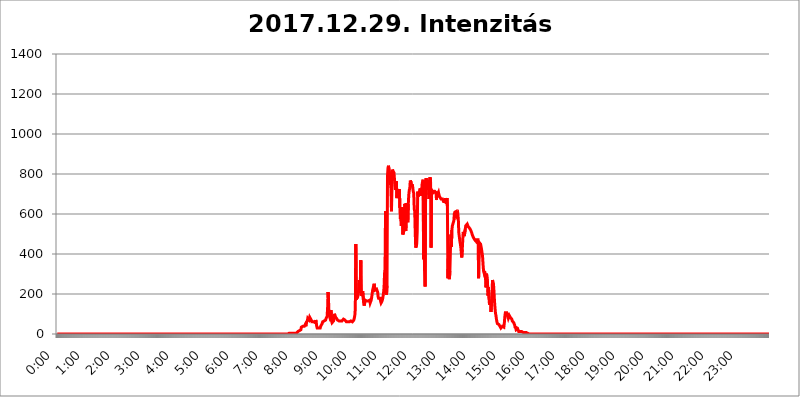
| Category | 2017.12.29. Intenzitás [W/m^2] |
|---|---|
| 0.0 | 0 |
| 0.0006944444444444445 | 0 |
| 0.001388888888888889 | 0 |
| 0.0020833333333333333 | 0 |
| 0.002777777777777778 | 0 |
| 0.003472222222222222 | 0 |
| 0.004166666666666667 | 0 |
| 0.004861111111111111 | 0 |
| 0.005555555555555556 | 0 |
| 0.0062499999999999995 | 0 |
| 0.006944444444444444 | 0 |
| 0.007638888888888889 | 0 |
| 0.008333333333333333 | 0 |
| 0.009027777777777779 | 0 |
| 0.009722222222222222 | 0 |
| 0.010416666666666666 | 0 |
| 0.011111111111111112 | 0 |
| 0.011805555555555555 | 0 |
| 0.012499999999999999 | 0 |
| 0.013194444444444444 | 0 |
| 0.013888888888888888 | 0 |
| 0.014583333333333332 | 0 |
| 0.015277777777777777 | 0 |
| 0.015972222222222224 | 0 |
| 0.016666666666666666 | 0 |
| 0.017361111111111112 | 0 |
| 0.018055555555555557 | 0 |
| 0.01875 | 0 |
| 0.019444444444444445 | 0 |
| 0.02013888888888889 | 0 |
| 0.020833333333333332 | 0 |
| 0.02152777777777778 | 0 |
| 0.022222222222222223 | 0 |
| 0.02291666666666667 | 0 |
| 0.02361111111111111 | 0 |
| 0.024305555555555556 | 0 |
| 0.024999999999999998 | 0 |
| 0.025694444444444447 | 0 |
| 0.02638888888888889 | 0 |
| 0.027083333333333334 | 0 |
| 0.027777777777777776 | 0 |
| 0.02847222222222222 | 0 |
| 0.029166666666666664 | 0 |
| 0.029861111111111113 | 0 |
| 0.030555555555555555 | 0 |
| 0.03125 | 0 |
| 0.03194444444444445 | 0 |
| 0.03263888888888889 | 0 |
| 0.03333333333333333 | 0 |
| 0.034027777777777775 | 0 |
| 0.034722222222222224 | 0 |
| 0.035416666666666666 | 0 |
| 0.036111111111111115 | 0 |
| 0.03680555555555556 | 0 |
| 0.0375 | 0 |
| 0.03819444444444444 | 0 |
| 0.03888888888888889 | 0 |
| 0.03958333333333333 | 0 |
| 0.04027777777777778 | 0 |
| 0.04097222222222222 | 0 |
| 0.041666666666666664 | 0 |
| 0.042361111111111106 | 0 |
| 0.04305555555555556 | 0 |
| 0.043750000000000004 | 0 |
| 0.044444444444444446 | 0 |
| 0.04513888888888889 | 0 |
| 0.04583333333333334 | 0 |
| 0.04652777777777778 | 0 |
| 0.04722222222222222 | 0 |
| 0.04791666666666666 | 0 |
| 0.04861111111111111 | 0 |
| 0.049305555555555554 | 0 |
| 0.049999999999999996 | 0 |
| 0.05069444444444445 | 0 |
| 0.051388888888888894 | 0 |
| 0.052083333333333336 | 0 |
| 0.05277777777777778 | 0 |
| 0.05347222222222222 | 0 |
| 0.05416666666666667 | 0 |
| 0.05486111111111111 | 0 |
| 0.05555555555555555 | 0 |
| 0.05625 | 0 |
| 0.05694444444444444 | 0 |
| 0.057638888888888885 | 0 |
| 0.05833333333333333 | 0 |
| 0.05902777777777778 | 0 |
| 0.059722222222222225 | 0 |
| 0.06041666666666667 | 0 |
| 0.061111111111111116 | 0 |
| 0.06180555555555556 | 0 |
| 0.0625 | 0 |
| 0.06319444444444444 | 0 |
| 0.06388888888888888 | 0 |
| 0.06458333333333334 | 0 |
| 0.06527777777777778 | 0 |
| 0.06597222222222222 | 0 |
| 0.06666666666666667 | 0 |
| 0.06736111111111111 | 0 |
| 0.06805555555555555 | 0 |
| 0.06874999999999999 | 0 |
| 0.06944444444444443 | 0 |
| 0.07013888888888889 | 0 |
| 0.07083333333333333 | 0 |
| 0.07152777777777779 | 0 |
| 0.07222222222222223 | 0 |
| 0.07291666666666667 | 0 |
| 0.07361111111111111 | 0 |
| 0.07430555555555556 | 0 |
| 0.075 | 0 |
| 0.07569444444444444 | 0 |
| 0.0763888888888889 | 0 |
| 0.07708333333333334 | 0 |
| 0.07777777777777778 | 0 |
| 0.07847222222222222 | 0 |
| 0.07916666666666666 | 0 |
| 0.0798611111111111 | 0 |
| 0.08055555555555556 | 0 |
| 0.08125 | 0 |
| 0.08194444444444444 | 0 |
| 0.08263888888888889 | 0 |
| 0.08333333333333333 | 0 |
| 0.08402777777777777 | 0 |
| 0.08472222222222221 | 0 |
| 0.08541666666666665 | 0 |
| 0.08611111111111112 | 0 |
| 0.08680555555555557 | 0 |
| 0.08750000000000001 | 0 |
| 0.08819444444444445 | 0 |
| 0.08888888888888889 | 0 |
| 0.08958333333333333 | 0 |
| 0.09027777777777778 | 0 |
| 0.09097222222222222 | 0 |
| 0.09166666666666667 | 0 |
| 0.09236111111111112 | 0 |
| 0.09305555555555556 | 0 |
| 0.09375 | 0 |
| 0.09444444444444444 | 0 |
| 0.09513888888888888 | 0 |
| 0.09583333333333333 | 0 |
| 0.09652777777777777 | 0 |
| 0.09722222222222222 | 0 |
| 0.09791666666666667 | 0 |
| 0.09861111111111111 | 0 |
| 0.09930555555555555 | 0 |
| 0.09999999999999999 | 0 |
| 0.10069444444444443 | 0 |
| 0.1013888888888889 | 0 |
| 0.10208333333333335 | 0 |
| 0.10277777777777779 | 0 |
| 0.10347222222222223 | 0 |
| 0.10416666666666667 | 0 |
| 0.10486111111111111 | 0 |
| 0.10555555555555556 | 0 |
| 0.10625 | 0 |
| 0.10694444444444444 | 0 |
| 0.1076388888888889 | 0 |
| 0.10833333333333334 | 0 |
| 0.10902777777777778 | 0 |
| 0.10972222222222222 | 0 |
| 0.1111111111111111 | 0 |
| 0.11180555555555556 | 0 |
| 0.11180555555555556 | 0 |
| 0.1125 | 0 |
| 0.11319444444444444 | 0 |
| 0.11388888888888889 | 0 |
| 0.11458333333333333 | 0 |
| 0.11527777777777777 | 0 |
| 0.11597222222222221 | 0 |
| 0.11666666666666665 | 0 |
| 0.1173611111111111 | 0 |
| 0.11805555555555557 | 0 |
| 0.11944444444444445 | 0 |
| 0.12013888888888889 | 0 |
| 0.12083333333333333 | 0 |
| 0.12152777777777778 | 0 |
| 0.12222222222222223 | 0 |
| 0.12291666666666667 | 0 |
| 0.12291666666666667 | 0 |
| 0.12361111111111112 | 0 |
| 0.12430555555555556 | 0 |
| 0.125 | 0 |
| 0.12569444444444444 | 0 |
| 0.12638888888888888 | 0 |
| 0.12708333333333333 | 0 |
| 0.16875 | 0 |
| 0.12847222222222224 | 0 |
| 0.12916666666666668 | 0 |
| 0.12986111111111112 | 0 |
| 0.13055555555555556 | 0 |
| 0.13125 | 0 |
| 0.13194444444444445 | 0 |
| 0.1326388888888889 | 0 |
| 0.13333333333333333 | 0 |
| 0.13402777777777777 | 0 |
| 0.13402777777777777 | 0 |
| 0.13472222222222222 | 0 |
| 0.13541666666666666 | 0 |
| 0.1361111111111111 | 0 |
| 0.13749999999999998 | 0 |
| 0.13819444444444443 | 0 |
| 0.1388888888888889 | 0 |
| 0.13958333333333334 | 0 |
| 0.14027777777777778 | 0 |
| 0.14097222222222222 | 0 |
| 0.14166666666666666 | 0 |
| 0.1423611111111111 | 0 |
| 0.14305555555555557 | 0 |
| 0.14375000000000002 | 0 |
| 0.14444444444444446 | 0 |
| 0.1451388888888889 | 0 |
| 0.1451388888888889 | 0 |
| 0.14652777777777778 | 0 |
| 0.14722222222222223 | 0 |
| 0.14791666666666667 | 0 |
| 0.1486111111111111 | 0 |
| 0.14930555555555555 | 0 |
| 0.15 | 0 |
| 0.15069444444444444 | 0 |
| 0.15138888888888888 | 0 |
| 0.15208333333333332 | 0 |
| 0.15277777777777776 | 0 |
| 0.15347222222222223 | 0 |
| 0.15416666666666667 | 0 |
| 0.15486111111111112 | 0 |
| 0.15555555555555556 | 0 |
| 0.15625 | 0 |
| 0.15694444444444444 | 0 |
| 0.15763888888888888 | 0 |
| 0.15833333333333333 | 0 |
| 0.15902777777777777 | 0 |
| 0.15972222222222224 | 0 |
| 0.16041666666666668 | 0 |
| 0.16111111111111112 | 0 |
| 0.16180555555555556 | 0 |
| 0.1625 | 0 |
| 0.16319444444444445 | 0 |
| 0.1638888888888889 | 0 |
| 0.16458333333333333 | 0 |
| 0.16527777777777777 | 0 |
| 0.16597222222222222 | 0 |
| 0.16666666666666666 | 0 |
| 0.1673611111111111 | 0 |
| 0.16805555555555554 | 0 |
| 0.16874999999999998 | 0 |
| 0.16944444444444443 | 0 |
| 0.17013888888888887 | 0 |
| 0.1708333333333333 | 0 |
| 0.17152777777777775 | 0 |
| 0.17222222222222225 | 0 |
| 0.1729166666666667 | 0 |
| 0.17361111111111113 | 0 |
| 0.17430555555555557 | 0 |
| 0.17500000000000002 | 0 |
| 0.17569444444444446 | 0 |
| 0.1763888888888889 | 0 |
| 0.17708333333333334 | 0 |
| 0.17777777777777778 | 0 |
| 0.17847222222222223 | 0 |
| 0.17916666666666667 | 0 |
| 0.1798611111111111 | 0 |
| 0.18055555555555555 | 0 |
| 0.18125 | 0 |
| 0.18194444444444444 | 0 |
| 0.1826388888888889 | 0 |
| 0.18333333333333335 | 0 |
| 0.1840277777777778 | 0 |
| 0.18472222222222223 | 0 |
| 0.18541666666666667 | 0 |
| 0.18611111111111112 | 0 |
| 0.18680555555555556 | 0 |
| 0.1875 | 0 |
| 0.18819444444444444 | 0 |
| 0.18888888888888888 | 0 |
| 0.18958333333333333 | 0 |
| 0.19027777777777777 | 0 |
| 0.1909722222222222 | 0 |
| 0.19166666666666665 | 0 |
| 0.19236111111111112 | 0 |
| 0.19305555555555554 | 0 |
| 0.19375 | 0 |
| 0.19444444444444445 | 0 |
| 0.1951388888888889 | 0 |
| 0.19583333333333333 | 0 |
| 0.19652777777777777 | 0 |
| 0.19722222222222222 | 0 |
| 0.19791666666666666 | 0 |
| 0.1986111111111111 | 0 |
| 0.19930555555555554 | 0 |
| 0.19999999999999998 | 0 |
| 0.20069444444444443 | 0 |
| 0.20138888888888887 | 0 |
| 0.2020833333333333 | 0 |
| 0.2027777777777778 | 0 |
| 0.2034722222222222 | 0 |
| 0.2041666666666667 | 0 |
| 0.20486111111111113 | 0 |
| 0.20555555555555557 | 0 |
| 0.20625000000000002 | 0 |
| 0.20694444444444446 | 0 |
| 0.2076388888888889 | 0 |
| 0.20833333333333334 | 0 |
| 0.20902777777777778 | 0 |
| 0.20972222222222223 | 0 |
| 0.21041666666666667 | 0 |
| 0.2111111111111111 | 0 |
| 0.21180555555555555 | 0 |
| 0.2125 | 0 |
| 0.21319444444444444 | 0 |
| 0.2138888888888889 | 0 |
| 0.21458333333333335 | 0 |
| 0.2152777777777778 | 0 |
| 0.21597222222222223 | 0 |
| 0.21666666666666667 | 0 |
| 0.21736111111111112 | 0 |
| 0.21805555555555556 | 0 |
| 0.21875 | 0 |
| 0.21944444444444444 | 0 |
| 0.22013888888888888 | 0 |
| 0.22083333333333333 | 0 |
| 0.22152777777777777 | 0 |
| 0.2222222222222222 | 0 |
| 0.22291666666666665 | 0 |
| 0.2236111111111111 | 0 |
| 0.22430555555555556 | 0 |
| 0.225 | 0 |
| 0.22569444444444445 | 0 |
| 0.2263888888888889 | 0 |
| 0.22708333333333333 | 0 |
| 0.22777777777777777 | 0 |
| 0.22847222222222222 | 0 |
| 0.22916666666666666 | 0 |
| 0.2298611111111111 | 0 |
| 0.23055555555555554 | 0 |
| 0.23124999999999998 | 0 |
| 0.23194444444444443 | 0 |
| 0.23263888888888887 | 0 |
| 0.2333333333333333 | 0 |
| 0.2340277777777778 | 0 |
| 0.2347222222222222 | 0 |
| 0.2354166666666667 | 0 |
| 0.23611111111111113 | 0 |
| 0.23680555555555557 | 0 |
| 0.23750000000000002 | 0 |
| 0.23819444444444446 | 0 |
| 0.2388888888888889 | 0 |
| 0.23958333333333334 | 0 |
| 0.24027777777777778 | 0 |
| 0.24097222222222223 | 0 |
| 0.24166666666666667 | 0 |
| 0.2423611111111111 | 0 |
| 0.24305555555555555 | 0 |
| 0.24375 | 0 |
| 0.24444444444444446 | 0 |
| 0.24513888888888888 | 0 |
| 0.24583333333333335 | 0 |
| 0.2465277777777778 | 0 |
| 0.24722222222222223 | 0 |
| 0.24791666666666667 | 0 |
| 0.24861111111111112 | 0 |
| 0.24930555555555556 | 0 |
| 0.25 | 0 |
| 0.25069444444444444 | 0 |
| 0.2513888888888889 | 0 |
| 0.2520833333333333 | 0 |
| 0.25277777777777777 | 0 |
| 0.2534722222222222 | 0 |
| 0.25416666666666665 | 0 |
| 0.2548611111111111 | 0 |
| 0.2555555555555556 | 0 |
| 0.25625000000000003 | 0 |
| 0.2569444444444445 | 0 |
| 0.2576388888888889 | 0 |
| 0.25833333333333336 | 0 |
| 0.2590277777777778 | 0 |
| 0.25972222222222224 | 0 |
| 0.2604166666666667 | 0 |
| 0.2611111111111111 | 0 |
| 0.26180555555555557 | 0 |
| 0.2625 | 0 |
| 0.26319444444444445 | 0 |
| 0.2638888888888889 | 0 |
| 0.26458333333333334 | 0 |
| 0.2652777777777778 | 0 |
| 0.2659722222222222 | 0 |
| 0.26666666666666666 | 0 |
| 0.2673611111111111 | 0 |
| 0.26805555555555555 | 0 |
| 0.26875 | 0 |
| 0.26944444444444443 | 0 |
| 0.2701388888888889 | 0 |
| 0.2708333333333333 | 0 |
| 0.27152777777777776 | 0 |
| 0.2722222222222222 | 0 |
| 0.27291666666666664 | 0 |
| 0.2736111111111111 | 0 |
| 0.2743055555555555 | 0 |
| 0.27499999999999997 | 0 |
| 0.27569444444444446 | 0 |
| 0.27638888888888885 | 0 |
| 0.27708333333333335 | 0 |
| 0.2777777777777778 | 0 |
| 0.27847222222222223 | 0 |
| 0.2791666666666667 | 0 |
| 0.2798611111111111 | 0 |
| 0.28055555555555556 | 0 |
| 0.28125 | 0 |
| 0.28194444444444444 | 0 |
| 0.2826388888888889 | 0 |
| 0.2833333333333333 | 0 |
| 0.28402777777777777 | 0 |
| 0.2847222222222222 | 0 |
| 0.28541666666666665 | 0 |
| 0.28611111111111115 | 0 |
| 0.28680555555555554 | 0 |
| 0.28750000000000003 | 0 |
| 0.2881944444444445 | 0 |
| 0.2888888888888889 | 0 |
| 0.28958333333333336 | 0 |
| 0.2902777777777778 | 0 |
| 0.29097222222222224 | 0 |
| 0.2916666666666667 | 0 |
| 0.2923611111111111 | 0 |
| 0.29305555555555557 | 0 |
| 0.29375 | 0 |
| 0.29444444444444445 | 0 |
| 0.2951388888888889 | 0 |
| 0.29583333333333334 | 0 |
| 0.2965277777777778 | 0 |
| 0.2972222222222222 | 0 |
| 0.29791666666666666 | 0 |
| 0.2986111111111111 | 0 |
| 0.29930555555555555 | 0 |
| 0.3 | 0 |
| 0.30069444444444443 | 0 |
| 0.3013888888888889 | 0 |
| 0.3020833333333333 | 0 |
| 0.30277777777777776 | 0 |
| 0.3034722222222222 | 0 |
| 0.30416666666666664 | 0 |
| 0.3048611111111111 | 0 |
| 0.3055555555555555 | 0 |
| 0.30624999999999997 | 0 |
| 0.3069444444444444 | 0 |
| 0.3076388888888889 | 0 |
| 0.30833333333333335 | 0 |
| 0.3090277777777778 | 0 |
| 0.30972222222222223 | 0 |
| 0.3104166666666667 | 0 |
| 0.3111111111111111 | 0 |
| 0.31180555555555556 | 0 |
| 0.3125 | 0 |
| 0.31319444444444444 | 0 |
| 0.3138888888888889 | 0 |
| 0.3145833333333333 | 0 |
| 0.31527777777777777 | 0 |
| 0.3159722222222222 | 3.525 |
| 0.31666666666666665 | 0 |
| 0.31736111111111115 | 3.525 |
| 0.31805555555555554 | 0 |
| 0.31875000000000003 | 0 |
| 0.3194444444444445 | 0 |
| 0.3201388888888889 | 0 |
| 0.32083333333333336 | 0 |
| 0.3215277777777778 | 0 |
| 0.32222222222222224 | 0 |
| 0.3229166666666667 | 0 |
| 0.3236111111111111 | 3.525 |
| 0.32430555555555557 | 3.525 |
| 0.325 | 3.525 |
| 0.32569444444444445 | 3.525 |
| 0.3263888888888889 | 3.525 |
| 0.32708333333333334 | 3.525 |
| 0.3277777777777778 | 3.525 |
| 0.3284722222222222 | 3.525 |
| 0.32916666666666666 | 3.525 |
| 0.3298611111111111 | 3.525 |
| 0.33055555555555555 | 3.525 |
| 0.33125 | 3.525 |
| 0.33194444444444443 | 3.525 |
| 0.3326388888888889 | 3.525 |
| 0.3333333333333333 | 3.525 |
| 0.3340277777777778 | 3.525 |
| 0.3347222222222222 | 3.525 |
| 0.3354166666666667 | 3.525 |
| 0.3361111111111111 | 7.887 |
| 0.3368055555555556 | 7.887 |
| 0.33749999999999997 | 12.257 |
| 0.33819444444444446 | 12.257 |
| 0.33888888888888885 | 16.636 |
| 0.33958333333333335 | 16.636 |
| 0.34027777777777773 | 21.024 |
| 0.34097222222222223 | 21.024 |
| 0.3416666666666666 | 21.024 |
| 0.3423611111111111 | 34.234 |
| 0.3430555555555555 | 29.823 |
| 0.34375 | 34.234 |
| 0.3444444444444445 | 38.653 |
| 0.3451388888888889 | 43.079 |
| 0.3458333333333334 | 34.234 |
| 0.34652777777777777 | 38.653 |
| 0.34722222222222227 | 38.653 |
| 0.34791666666666665 | 47.511 |
| 0.34861111111111115 | 38.653 |
| 0.34930555555555554 | 56.398 |
| 0.35000000000000003 | 60.85 |
| 0.3506944444444444 | 65.31 |
| 0.3513888888888889 | 78.722 |
| 0.3520833333333333 | 78.722 |
| 0.3527777777777778 | 78.722 |
| 0.3534722222222222 | 69.775 |
| 0.3541666666666667 | 83.205 |
| 0.3548611111111111 | 78.722 |
| 0.35555555555555557 | 74.246 |
| 0.35625 | 74.246 |
| 0.35694444444444445 | 69.775 |
| 0.3576388888888889 | 60.85 |
| 0.35833333333333334 | 60.85 |
| 0.3590277777777778 | 60.85 |
| 0.3597222222222222 | 60.85 |
| 0.36041666666666666 | 56.398 |
| 0.3611111111111111 | 65.31 |
| 0.36180555555555555 | 56.398 |
| 0.3625 | 69.775 |
| 0.36319444444444443 | 60.85 |
| 0.3638888888888889 | 38.653 |
| 0.3645833333333333 | 29.823 |
| 0.3652777777777778 | 29.823 |
| 0.3659722222222222 | 25.419 |
| 0.3666666666666667 | 29.823 |
| 0.3673611111111111 | 29.823 |
| 0.3680555555555556 | 34.234 |
| 0.36874999999999997 | 29.823 |
| 0.36944444444444446 | 38.653 |
| 0.37013888888888885 | 38.653 |
| 0.37083333333333335 | 43.079 |
| 0.37152777777777773 | 51.951 |
| 0.37222222222222223 | 60.85 |
| 0.3729166666666666 | 65.31 |
| 0.3736111111111111 | 65.31 |
| 0.3743055555555555 | 65.31 |
| 0.375 | 60.85 |
| 0.3756944444444445 | 65.31 |
| 0.3763888888888889 | 69.775 |
| 0.3770833333333334 | 78.722 |
| 0.37777777777777777 | 74.246 |
| 0.37847222222222227 | 87.692 |
| 0.37916666666666665 | 128.284 |
| 0.37986111111111115 | 210.182 |
| 0.38055555555555554 | 160.056 |
| 0.38125000000000003 | 96.682 |
| 0.3819444444444444 | 87.692 |
| 0.3826388888888889 | 96.682 |
| 0.3833333333333333 | 92.184 |
| 0.3840277777777778 | 119.235 |
| 0.3847222222222222 | 65.31 |
| 0.3854166666666667 | 56.398 |
| 0.3861111111111111 | 56.398 |
| 0.38680555555555557 | 60.85 |
| 0.3875 | 65.31 |
| 0.38819444444444445 | 74.246 |
| 0.3888888888888889 | 101.184 |
| 0.38958333333333334 | 87.692 |
| 0.3902777777777778 | 83.205 |
| 0.3909722222222222 | 83.205 |
| 0.39166666666666666 | 78.722 |
| 0.3923611111111111 | 74.246 |
| 0.39305555555555555 | 69.775 |
| 0.39375 | 69.775 |
| 0.39444444444444443 | 65.31 |
| 0.3951388888888889 | 65.31 |
| 0.3958333333333333 | 65.31 |
| 0.3965277777777778 | 65.31 |
| 0.3972222222222222 | 65.31 |
| 0.3979166666666667 | 65.31 |
| 0.3986111111111111 | 65.31 |
| 0.3993055555555556 | 65.31 |
| 0.39999999999999997 | 65.31 |
| 0.40069444444444446 | 69.775 |
| 0.40138888888888885 | 74.246 |
| 0.40208333333333335 | 74.246 |
| 0.40277777777777773 | 74.246 |
| 0.40347222222222223 | 69.775 |
| 0.4041666666666666 | 69.775 |
| 0.4048611111111111 | 65.31 |
| 0.4055555555555555 | 60.85 |
| 0.40625 | 60.85 |
| 0.4069444444444445 | 60.85 |
| 0.4076388888888889 | 60.85 |
| 0.4083333333333334 | 60.85 |
| 0.40902777777777777 | 60.85 |
| 0.40972222222222227 | 60.85 |
| 0.41041666666666665 | 60.85 |
| 0.41111111111111115 | 65.31 |
| 0.41180555555555554 | 65.31 |
| 0.41250000000000003 | 65.31 |
| 0.4131944444444444 | 60.85 |
| 0.4138888888888889 | 60.85 |
| 0.4145833333333333 | 60.85 |
| 0.4152777777777778 | 65.31 |
| 0.4159722222222222 | 69.775 |
| 0.4166666666666667 | 74.246 |
| 0.4173611111111111 | 92.184 |
| 0.41805555555555557 | 128.284 |
| 0.41875 | 449.551 |
| 0.41944444444444445 | 173.709 |
| 0.4201388888888889 | 173.709 |
| 0.42083333333333334 | 173.709 |
| 0.4215277777777778 | 187.378 |
| 0.4222222222222222 | 201.058 |
| 0.42291666666666666 | 223.873 |
| 0.4236111111111111 | 269.49 |
| 0.42430555555555555 | 269.49 |
| 0.425 | 219.309 |
| 0.42569444444444443 | 369.23 |
| 0.4263888888888889 | 191.937 |
| 0.4270833333333333 | 191.937 |
| 0.4277777777777778 | 205.62 |
| 0.4284722222222222 | 214.746 |
| 0.4291666666666667 | 178.264 |
| 0.4298611111111111 | 150.964 |
| 0.4305555555555556 | 141.884 |
| 0.43124999999999997 | 155.509 |
| 0.43194444444444446 | 169.156 |
| 0.43263888888888885 | 164.605 |
| 0.43333333333333335 | 164.605 |
| 0.43402777777777773 | 164.605 |
| 0.43472222222222223 | 160.056 |
| 0.4354166666666666 | 164.605 |
| 0.4361111111111111 | 164.605 |
| 0.4368055555555555 | 160.056 |
| 0.4375 | 169.156 |
| 0.4381944444444445 | 169.156 |
| 0.4388888888888889 | 155.509 |
| 0.4395833333333334 | 155.509 |
| 0.44027777777777777 | 169.156 |
| 0.44097222222222227 | 182.82 |
| 0.44166666666666665 | 201.058 |
| 0.44236111111111115 | 219.309 |
| 0.44305555555555554 | 214.746 |
| 0.44375000000000003 | 223.873 |
| 0.4444444444444444 | 251.251 |
| 0.4451388888888889 | 233 |
| 0.4458333333333333 | 219.309 |
| 0.4465277777777778 | 214.746 |
| 0.4472222222222222 | 223.873 |
| 0.4479166666666667 | 223.873 |
| 0.4486111111111111 | 223.873 |
| 0.44930555555555557 | 210.182 |
| 0.45 | 187.378 |
| 0.45069444444444445 | 178.264 |
| 0.4513888888888889 | 178.264 |
| 0.45208333333333334 | 178.264 |
| 0.4527777777777778 | 178.264 |
| 0.4534722222222222 | 164.605 |
| 0.45416666666666666 | 155.509 |
| 0.4548611111111111 | 155.509 |
| 0.45555555555555555 | 164.605 |
| 0.45625 | 173.709 |
| 0.45694444444444443 | 187.378 |
| 0.4576388888888889 | 205.62 |
| 0.4583333333333333 | 233 |
| 0.4590277777777778 | 301.354 |
| 0.4597222222222222 | 328.584 |
| 0.4604166666666667 | 613.252 |
| 0.4611111111111111 | 233 |
| 0.4618055555555556 | 196.497 |
| 0.46249999999999997 | 242.127 |
| 0.46319444444444446 | 791.169 |
| 0.46388888888888885 | 829.981 |
| 0.46458333333333335 | 841.526 |
| 0.46527777777777773 | 837.682 |
| 0.46597222222222223 | 802.868 |
| 0.4666666666666666 | 791.169 |
| 0.4673611111111111 | 755.766 |
| 0.4680555555555555 | 723.889 |
| 0.46875 | 613.252 |
| 0.4694444444444445 | 798.974 |
| 0.4701388888888889 | 822.26 |
| 0.4708333333333334 | 814.519 |
| 0.47152777777777777 | 818.392 |
| 0.47222222222222227 | 806.757 |
| 0.47291666666666665 | 806.757 |
| 0.47361111111111115 | 810.641 |
| 0.47430555555555554 | 719.877 |
| 0.47500000000000003 | 751.803 |
| 0.4756944444444444 | 763.674 |
| 0.4763888888888889 | 679.395 |
| 0.4770833333333333 | 683.473 |
| 0.4777777777777778 | 711.832 |
| 0.4784722222222222 | 711.832 |
| 0.4791666666666667 | 687.544 |
| 0.4798611111111111 | 723.889 |
| 0.48055555555555557 | 629.948 |
| 0.48125 | 575.299 |
| 0.48194444444444445 | 588.009 |
| 0.4826388888888889 | 541.121 |
| 0.48333333333333334 | 583.779 |
| 0.4840277777777778 | 634.105 |
| 0.4847222222222222 | 497.836 |
| 0.48541666666666666 | 497.836 |
| 0.4861111111111111 | 515.223 |
| 0.48680555555555555 | 536.82 |
| 0.4875 | 650.667 |
| 0.48819444444444443 | 583.779 |
| 0.4888888888888889 | 515.223 |
| 0.4895833333333333 | 654.791 |
| 0.4902777777777778 | 654.791 |
| 0.4909722222222222 | 592.233 |
| 0.4916666666666667 | 558.261 |
| 0.4923611111111111 | 650.667 |
| 0.4930555555555556 | 695.666 |
| 0.49374999999999997 | 719.877 |
| 0.49444444444444446 | 727.896 |
| 0.49513888888888885 | 767.62 |
| 0.49583333333333335 | 767.62 |
| 0.49652777777777773 | 755.766 |
| 0.49722222222222223 | 735.89 |
| 0.4979166666666666 | 747.834 |
| 0.4986111111111111 | 731.896 |
| 0.4993055555555555 | 711.832 |
| 0.5 | 703.762 |
| 0.5006944444444444 | 625.784 |
| 0.5013888888888889 | 613.252 |
| 0.5020833333333333 | 506.542 |
| 0.5027777777777778 | 431.833 |
| 0.5034722222222222 | 431.833 |
| 0.5041666666666667 | 449.551 |
| 0.5048611111111111 | 510.885 |
| 0.5055555555555555 | 711.832 |
| 0.50625 | 687.544 |
| 0.5069444444444444 | 699.717 |
| 0.5076388888888889 | 707.8 |
| 0.5083333333333333 | 715.858 |
| 0.5090277777777777 | 727.896 |
| 0.5097222222222222 | 691.608 |
| 0.5104166666666666 | 699.717 |
| 0.5111111111111112 | 719.877 |
| 0.5118055555555555 | 751.803 |
| 0.5125000000000001 | 755.766 |
| 0.5131944444444444 | 771.559 |
| 0.513888888888889 | 373.729 |
| 0.5145833333333333 | 440.702 |
| 0.5152777777777778 | 314.98 |
| 0.5159722222222222 | 237.564 |
| 0.5166666666666667 | 763.674 |
| 0.517361111111111 | 779.42 |
| 0.5180555555555556 | 751.803 |
| 0.5187499999999999 | 723.889 |
| 0.5194444444444445 | 755.766 |
| 0.5201388888888888 | 771.559 |
| 0.5208333333333334 | 767.62 |
| 0.5215277777777778 | 675.311 |
| 0.5222222222222223 | 671.22 |
| 0.5229166666666667 | 783.342 |
| 0.5236111111111111 | 759.723 |
| 0.5243055555555556 | 431.833 |
| 0.525 | 719.877 |
| 0.5256944444444445 | 715.858 |
| 0.5263888888888889 | 711.832 |
| 0.5270833333333333 | 719.877 |
| 0.5277777777777778 | 707.8 |
| 0.5284722222222222 | 711.832 |
| 0.5291666666666667 | 711.832 |
| 0.5298611111111111 | 711.832 |
| 0.5305555555555556 | 711.832 |
| 0.53125 | 703.762 |
| 0.5319444444444444 | 671.22 |
| 0.5326388888888889 | 711.832 |
| 0.5333333333333333 | 695.666 |
| 0.5340277777777778 | 699.717 |
| 0.5347222222222222 | 707.8 |
| 0.5354166666666667 | 695.666 |
| 0.5361111111111111 | 687.544 |
| 0.5368055555555555 | 683.473 |
| 0.5375 | 683.473 |
| 0.5381944444444444 | 675.311 |
| 0.5388888888888889 | 671.22 |
| 0.5395833333333333 | 675.311 |
| 0.5402777777777777 | 675.311 |
| 0.5409722222222222 | 675.311 |
| 0.5416666666666666 | 663.019 |
| 0.5423611111111112 | 658.909 |
| 0.5430555555555555 | 663.019 |
| 0.5437500000000001 | 663.019 |
| 0.5444444444444444 | 679.395 |
| 0.545138888888889 | 675.311 |
| 0.5458333333333333 | 650.667 |
| 0.5465277777777778 | 679.395 |
| 0.5472222222222222 | 638.256 |
| 0.5479166666666667 | 278.603 |
| 0.548611111111111 | 382.715 |
| 0.5493055555555556 | 287.709 |
| 0.5499999999999999 | 274.047 |
| 0.5506944444444445 | 314.98 |
| 0.5513888888888888 | 414.035 |
| 0.5520833333333334 | 497.836 |
| 0.5527777777777778 | 436.27 |
| 0.5534722222222223 | 519.555 |
| 0.5541666666666667 | 541.121 |
| 0.5548611111111111 | 545.416 |
| 0.5555555555555556 | 545.416 |
| 0.55625 | 566.793 |
| 0.5569444444444445 | 600.661 |
| 0.5576388888888889 | 609.062 |
| 0.5583333333333333 | 613.252 |
| 0.5590277777777778 | 613.252 |
| 0.5597222222222222 | 613.252 |
| 0.5604166666666667 | 592.233 |
| 0.5611111111111111 | 592.233 |
| 0.5618055555555556 | 600.661 |
| 0.5625 | 575.299 |
| 0.5631944444444444 | 506.542 |
| 0.5638888888888889 | 502.192 |
| 0.5645833333333333 | 467.187 |
| 0.5652777777777778 | 471.582 |
| 0.5659722222222222 | 436.27 |
| 0.5666666666666667 | 405.108 |
| 0.5673611111111111 | 382.715 |
| 0.5680555555555555 | 422.943 |
| 0.56875 | 471.582 |
| 0.5694444444444444 | 510.885 |
| 0.5701388888888889 | 497.836 |
| 0.5708333333333333 | 489.108 |
| 0.5715277777777777 | 493.475 |
| 0.5722222222222222 | 523.88 |
| 0.5729166666666666 | 541.121 |
| 0.5736111111111112 | 545.416 |
| 0.5743055555555555 | 545.416 |
| 0.5750000000000001 | 549.704 |
| 0.5756944444444444 | 545.416 |
| 0.576388888888889 | 536.82 |
| 0.5770833333333333 | 541.121 |
| 0.5777777777777778 | 532.513 |
| 0.5784722222222222 | 528.2 |
| 0.5791666666666667 | 523.88 |
| 0.579861111111111 | 519.555 |
| 0.5805555555555556 | 515.223 |
| 0.5812499999999999 | 506.542 |
| 0.5819444444444445 | 497.836 |
| 0.5826388888888888 | 493.475 |
| 0.5833333333333334 | 484.735 |
| 0.5840277777777778 | 480.356 |
| 0.5847222222222223 | 480.356 |
| 0.5854166666666667 | 471.582 |
| 0.5861111111111111 | 471.582 |
| 0.5868055555555556 | 471.582 |
| 0.5875 | 462.786 |
| 0.5881944444444445 | 471.582 |
| 0.5888888888888889 | 471.582 |
| 0.5895833333333333 | 471.582 |
| 0.5902777777777778 | 471.582 |
| 0.5909722222222222 | 278.603 |
| 0.5916666666666667 | 458.38 |
| 0.5923611111111111 | 458.38 |
| 0.5930555555555556 | 453.968 |
| 0.59375 | 449.551 |
| 0.5944444444444444 | 436.27 |
| 0.5951388888888889 | 422.943 |
| 0.5958333333333333 | 405.108 |
| 0.5965277777777778 | 387.202 |
| 0.5972222222222222 | 346.682 |
| 0.5979166666666667 | 314.98 |
| 0.5986111111111111 | 305.898 |
| 0.5993055555555555 | 314.98 |
| 0.6 | 314.98 |
| 0.6006944444444444 | 278.603 |
| 0.6013888888888889 | 233 |
| 0.6020833333333333 | 301.354 |
| 0.6027777777777777 | 305.898 |
| 0.6034722222222222 | 255.813 |
| 0.6041666666666666 | 191.937 |
| 0.6048611111111112 | 233 |
| 0.6055555555555555 | 178.264 |
| 0.6062500000000001 | 146.423 |
| 0.6069444444444444 | 169.156 |
| 0.607638888888889 | 155.509 |
| 0.6083333333333333 | 110.201 |
| 0.6090277777777778 | 105.69 |
| 0.6097222222222222 | 182.82 |
| 0.6104166666666667 | 269.49 |
| 0.611111111111111 | 260.373 |
| 0.6118055555555556 | 251.251 |
| 0.6124999999999999 | 214.746 |
| 0.6131944444444445 | 169.156 |
| 0.6138888888888888 | 132.814 |
| 0.6145833333333334 | 105.69 |
| 0.6152777777777778 | 92.184 |
| 0.6159722222222223 | 74.246 |
| 0.6166666666666667 | 60.85 |
| 0.6173611111111111 | 51.951 |
| 0.6180555555555556 | 51.951 |
| 0.61875 | 47.511 |
| 0.6194444444444445 | 47.511 |
| 0.6201388888888889 | 47.511 |
| 0.6208333333333333 | 38.653 |
| 0.6215277777777778 | 34.234 |
| 0.6222222222222222 | 29.823 |
| 0.6229166666666667 | 29.823 |
| 0.6236111111111111 | 29.823 |
| 0.6243055555555556 | 38.653 |
| 0.625 | 43.079 |
| 0.6256944444444444 | 43.079 |
| 0.6263888888888889 | 34.234 |
| 0.6270833333333333 | 56.398 |
| 0.6277777777777778 | 87.692 |
| 0.6284722222222222 | 105.69 |
| 0.6291666666666667 | 110.201 |
| 0.6298611111111111 | 101.184 |
| 0.6305555555555555 | 105.69 |
| 0.63125 | 101.184 |
| 0.6319444444444444 | 101.184 |
| 0.6326388888888889 | 78.722 |
| 0.6333333333333333 | 74.246 |
| 0.6340277777777777 | 92.184 |
| 0.6347222222222222 | 87.692 |
| 0.6354166666666666 | 83.205 |
| 0.6361111111111112 | 83.205 |
| 0.6368055555555555 | 78.722 |
| 0.6375000000000001 | 74.246 |
| 0.6381944444444444 | 65.31 |
| 0.638888888888889 | 65.31 |
| 0.6395833333333333 | 60.85 |
| 0.6402777777777778 | 56.398 |
| 0.6409722222222222 | 51.951 |
| 0.6416666666666667 | 43.079 |
| 0.642361111111111 | 29.823 |
| 0.6430555555555556 | 38.653 |
| 0.6437499999999999 | 21.024 |
| 0.6444444444444445 | 21.024 |
| 0.6451388888888888 | 21.024 |
| 0.6458333333333334 | 25.419 |
| 0.6465277777777778 | 21.024 |
| 0.6472222222222223 | 12.257 |
| 0.6479166666666667 | 12.257 |
| 0.6486111111111111 | 12.257 |
| 0.6493055555555556 | 12.257 |
| 0.65 | 12.257 |
| 0.6506944444444445 | 12.257 |
| 0.6513888888888889 | 12.257 |
| 0.6520833333333333 | 7.887 |
| 0.6527777777777778 | 7.887 |
| 0.6534722222222222 | 7.887 |
| 0.6541666666666667 | 7.887 |
| 0.6548611111111111 | 7.887 |
| 0.6555555555555556 | 7.887 |
| 0.65625 | 7.887 |
| 0.6569444444444444 | 7.887 |
| 0.6576388888888889 | 7.887 |
| 0.6583333333333333 | 3.525 |
| 0.6590277777777778 | 3.525 |
| 0.6597222222222222 | 3.525 |
| 0.6604166666666667 | 3.525 |
| 0.6611111111111111 | 3.525 |
| 0.6618055555555555 | 0 |
| 0.6625 | 0 |
| 0.6631944444444444 | 0 |
| 0.6638888888888889 | 0 |
| 0.6645833333333333 | 0 |
| 0.6652777777777777 | 0 |
| 0.6659722222222222 | 0 |
| 0.6666666666666666 | 0 |
| 0.6673611111111111 | 0 |
| 0.6680555555555556 | 0 |
| 0.6687500000000001 | 0 |
| 0.6694444444444444 | 0 |
| 0.6701388888888888 | 0 |
| 0.6708333333333334 | 0 |
| 0.6715277777777778 | 0 |
| 0.6722222222222222 | 0 |
| 0.6729166666666666 | 0 |
| 0.6736111111111112 | 0 |
| 0.6743055555555556 | 0 |
| 0.6749999999999999 | 0 |
| 0.6756944444444444 | 0 |
| 0.6763888888888889 | 0 |
| 0.6770833333333334 | 0 |
| 0.6777777777777777 | 0 |
| 0.6784722222222223 | 0 |
| 0.6791666666666667 | 0 |
| 0.6798611111111111 | 0 |
| 0.6805555555555555 | 0 |
| 0.68125 | 0 |
| 0.6819444444444445 | 0 |
| 0.6826388888888889 | 0 |
| 0.6833333333333332 | 0 |
| 0.6840277777777778 | 0 |
| 0.6847222222222222 | 0 |
| 0.6854166666666667 | 0 |
| 0.686111111111111 | 0 |
| 0.6868055555555556 | 0 |
| 0.6875 | 0 |
| 0.6881944444444444 | 0 |
| 0.688888888888889 | 0 |
| 0.6895833333333333 | 0 |
| 0.6902777777777778 | 0 |
| 0.6909722222222222 | 0 |
| 0.6916666666666668 | 0 |
| 0.6923611111111111 | 0 |
| 0.6930555555555555 | 0 |
| 0.69375 | 0 |
| 0.6944444444444445 | 0 |
| 0.6951388888888889 | 0 |
| 0.6958333333333333 | 0 |
| 0.6965277777777777 | 0 |
| 0.6972222222222223 | 0 |
| 0.6979166666666666 | 0 |
| 0.6986111111111111 | 0 |
| 0.6993055555555556 | 0 |
| 0.7000000000000001 | 0 |
| 0.7006944444444444 | 0 |
| 0.7013888888888888 | 0 |
| 0.7020833333333334 | 0 |
| 0.7027777777777778 | 0 |
| 0.7034722222222222 | 0 |
| 0.7041666666666666 | 0 |
| 0.7048611111111112 | 0 |
| 0.7055555555555556 | 0 |
| 0.7062499999999999 | 0 |
| 0.7069444444444444 | 0 |
| 0.7076388888888889 | 0 |
| 0.7083333333333334 | 0 |
| 0.7090277777777777 | 0 |
| 0.7097222222222223 | 0 |
| 0.7104166666666667 | 0 |
| 0.7111111111111111 | 0 |
| 0.7118055555555555 | 0 |
| 0.7125 | 0 |
| 0.7131944444444445 | 0 |
| 0.7138888888888889 | 0 |
| 0.7145833333333332 | 0 |
| 0.7152777777777778 | 0 |
| 0.7159722222222222 | 0 |
| 0.7166666666666667 | 0 |
| 0.717361111111111 | 0 |
| 0.7180555555555556 | 0 |
| 0.71875 | 0 |
| 0.7194444444444444 | 0 |
| 0.720138888888889 | 0 |
| 0.7208333333333333 | 0 |
| 0.7215277777777778 | 0 |
| 0.7222222222222222 | 0 |
| 0.7229166666666668 | 0 |
| 0.7236111111111111 | 0 |
| 0.7243055555555555 | 0 |
| 0.725 | 0 |
| 0.7256944444444445 | 0 |
| 0.7263888888888889 | 0 |
| 0.7270833333333333 | 0 |
| 0.7277777777777777 | 0 |
| 0.7284722222222223 | 0 |
| 0.7291666666666666 | 0 |
| 0.7298611111111111 | 0 |
| 0.7305555555555556 | 0 |
| 0.7312500000000001 | 0 |
| 0.7319444444444444 | 0 |
| 0.7326388888888888 | 0 |
| 0.7333333333333334 | 0 |
| 0.7340277777777778 | 0 |
| 0.7347222222222222 | 0 |
| 0.7354166666666666 | 0 |
| 0.7361111111111112 | 0 |
| 0.7368055555555556 | 0 |
| 0.7374999999999999 | 0 |
| 0.7381944444444444 | 0 |
| 0.7388888888888889 | 0 |
| 0.7395833333333334 | 0 |
| 0.7402777777777777 | 0 |
| 0.7409722222222223 | 0 |
| 0.7416666666666667 | 0 |
| 0.7423611111111111 | 0 |
| 0.7430555555555555 | 0 |
| 0.74375 | 0 |
| 0.7444444444444445 | 0 |
| 0.7451388888888889 | 0 |
| 0.7458333333333332 | 0 |
| 0.7465277777777778 | 0 |
| 0.7472222222222222 | 0 |
| 0.7479166666666667 | 0 |
| 0.748611111111111 | 0 |
| 0.7493055555555556 | 0 |
| 0.75 | 0 |
| 0.7506944444444444 | 0 |
| 0.751388888888889 | 0 |
| 0.7520833333333333 | 0 |
| 0.7527777777777778 | 0 |
| 0.7534722222222222 | 0 |
| 0.7541666666666668 | 0 |
| 0.7548611111111111 | 0 |
| 0.7555555555555555 | 0 |
| 0.75625 | 0 |
| 0.7569444444444445 | 0 |
| 0.7576388888888889 | 0 |
| 0.7583333333333333 | 0 |
| 0.7590277777777777 | 0 |
| 0.7597222222222223 | 0 |
| 0.7604166666666666 | 0 |
| 0.7611111111111111 | 0 |
| 0.7618055555555556 | 0 |
| 0.7625000000000001 | 0 |
| 0.7631944444444444 | 0 |
| 0.7638888888888888 | 0 |
| 0.7645833333333334 | 0 |
| 0.7652777777777778 | 0 |
| 0.7659722222222222 | 0 |
| 0.7666666666666666 | 0 |
| 0.7673611111111112 | 0 |
| 0.7680555555555556 | 0 |
| 0.7687499999999999 | 0 |
| 0.7694444444444444 | 0 |
| 0.7701388888888889 | 0 |
| 0.7708333333333334 | 0 |
| 0.7715277777777777 | 0 |
| 0.7722222222222223 | 0 |
| 0.7729166666666667 | 0 |
| 0.7736111111111111 | 0 |
| 0.7743055555555555 | 0 |
| 0.775 | 0 |
| 0.7756944444444445 | 0 |
| 0.7763888888888889 | 0 |
| 0.7770833333333332 | 0 |
| 0.7777777777777778 | 0 |
| 0.7784722222222222 | 0 |
| 0.7791666666666667 | 0 |
| 0.779861111111111 | 0 |
| 0.7805555555555556 | 0 |
| 0.78125 | 0 |
| 0.7819444444444444 | 0 |
| 0.782638888888889 | 0 |
| 0.7833333333333333 | 0 |
| 0.7840277777777778 | 0 |
| 0.7847222222222222 | 0 |
| 0.7854166666666668 | 0 |
| 0.7861111111111111 | 0 |
| 0.7868055555555555 | 0 |
| 0.7875 | 0 |
| 0.7881944444444445 | 0 |
| 0.7888888888888889 | 0 |
| 0.7895833333333333 | 0 |
| 0.7902777777777777 | 0 |
| 0.7909722222222223 | 0 |
| 0.7916666666666666 | 0 |
| 0.7923611111111111 | 0 |
| 0.7930555555555556 | 0 |
| 0.7937500000000001 | 0 |
| 0.7944444444444444 | 0 |
| 0.7951388888888888 | 0 |
| 0.7958333333333334 | 0 |
| 0.7965277777777778 | 0 |
| 0.7972222222222222 | 0 |
| 0.7979166666666666 | 0 |
| 0.7986111111111112 | 0 |
| 0.7993055555555556 | 0 |
| 0.7999999999999999 | 0 |
| 0.8006944444444444 | 0 |
| 0.8013888888888889 | 0 |
| 0.8020833333333334 | 0 |
| 0.8027777777777777 | 0 |
| 0.8034722222222223 | 0 |
| 0.8041666666666667 | 0 |
| 0.8048611111111111 | 0 |
| 0.8055555555555555 | 0 |
| 0.80625 | 0 |
| 0.8069444444444445 | 0 |
| 0.8076388888888889 | 0 |
| 0.8083333333333332 | 0 |
| 0.8090277777777778 | 0 |
| 0.8097222222222222 | 0 |
| 0.8104166666666667 | 0 |
| 0.811111111111111 | 0 |
| 0.8118055555555556 | 0 |
| 0.8125 | 0 |
| 0.8131944444444444 | 0 |
| 0.813888888888889 | 0 |
| 0.8145833333333333 | 0 |
| 0.8152777777777778 | 0 |
| 0.8159722222222222 | 0 |
| 0.8166666666666668 | 0 |
| 0.8173611111111111 | 0 |
| 0.8180555555555555 | 0 |
| 0.81875 | 0 |
| 0.8194444444444445 | 0 |
| 0.8201388888888889 | 0 |
| 0.8208333333333333 | 0 |
| 0.8215277777777777 | 0 |
| 0.8222222222222223 | 0 |
| 0.8229166666666666 | 0 |
| 0.8236111111111111 | 0 |
| 0.8243055555555556 | 0 |
| 0.8250000000000001 | 0 |
| 0.8256944444444444 | 0 |
| 0.8263888888888888 | 0 |
| 0.8270833333333334 | 0 |
| 0.8277777777777778 | 0 |
| 0.8284722222222222 | 0 |
| 0.8291666666666666 | 0 |
| 0.8298611111111112 | 0 |
| 0.8305555555555556 | 0 |
| 0.8312499999999999 | 0 |
| 0.8319444444444444 | 0 |
| 0.8326388888888889 | 0 |
| 0.8333333333333334 | 0 |
| 0.8340277777777777 | 0 |
| 0.8347222222222223 | 0 |
| 0.8354166666666667 | 0 |
| 0.8361111111111111 | 0 |
| 0.8368055555555555 | 0 |
| 0.8375 | 0 |
| 0.8381944444444445 | 0 |
| 0.8388888888888889 | 0 |
| 0.8395833333333332 | 0 |
| 0.8402777777777778 | 0 |
| 0.8409722222222222 | 0 |
| 0.8416666666666667 | 0 |
| 0.842361111111111 | 0 |
| 0.8430555555555556 | 0 |
| 0.84375 | 0 |
| 0.8444444444444444 | 0 |
| 0.845138888888889 | 0 |
| 0.8458333333333333 | 0 |
| 0.8465277777777778 | 0 |
| 0.8472222222222222 | 0 |
| 0.8479166666666668 | 0 |
| 0.8486111111111111 | 0 |
| 0.8493055555555555 | 0 |
| 0.85 | 0 |
| 0.8506944444444445 | 0 |
| 0.8513888888888889 | 0 |
| 0.8520833333333333 | 0 |
| 0.8527777777777777 | 0 |
| 0.8534722222222223 | 0 |
| 0.8541666666666666 | 0 |
| 0.8548611111111111 | 0 |
| 0.8555555555555556 | 0 |
| 0.8562500000000001 | 0 |
| 0.8569444444444444 | 0 |
| 0.8576388888888888 | 0 |
| 0.8583333333333334 | 0 |
| 0.8590277777777778 | 0 |
| 0.8597222222222222 | 0 |
| 0.8604166666666666 | 0 |
| 0.8611111111111112 | 0 |
| 0.8618055555555556 | 0 |
| 0.8624999999999999 | 0 |
| 0.8631944444444444 | 0 |
| 0.8638888888888889 | 0 |
| 0.8645833333333334 | 0 |
| 0.8652777777777777 | 0 |
| 0.8659722222222223 | 0 |
| 0.8666666666666667 | 0 |
| 0.8673611111111111 | 0 |
| 0.8680555555555555 | 0 |
| 0.86875 | 0 |
| 0.8694444444444445 | 0 |
| 0.8701388888888889 | 0 |
| 0.8708333333333332 | 0 |
| 0.8715277777777778 | 0 |
| 0.8722222222222222 | 0 |
| 0.8729166666666667 | 0 |
| 0.873611111111111 | 0 |
| 0.8743055555555556 | 0 |
| 0.875 | 0 |
| 0.8756944444444444 | 0 |
| 0.876388888888889 | 0 |
| 0.8770833333333333 | 0 |
| 0.8777777777777778 | 0 |
| 0.8784722222222222 | 0 |
| 0.8791666666666668 | 0 |
| 0.8798611111111111 | 0 |
| 0.8805555555555555 | 0 |
| 0.88125 | 0 |
| 0.8819444444444445 | 0 |
| 0.8826388888888889 | 0 |
| 0.8833333333333333 | 0 |
| 0.8840277777777777 | 0 |
| 0.8847222222222223 | 0 |
| 0.8854166666666666 | 0 |
| 0.8861111111111111 | 0 |
| 0.8868055555555556 | 0 |
| 0.8875000000000001 | 0 |
| 0.8881944444444444 | 0 |
| 0.8888888888888888 | 0 |
| 0.8895833333333334 | 0 |
| 0.8902777777777778 | 0 |
| 0.8909722222222222 | 0 |
| 0.8916666666666666 | 0 |
| 0.8923611111111112 | 0 |
| 0.8930555555555556 | 0 |
| 0.8937499999999999 | 0 |
| 0.8944444444444444 | 0 |
| 0.8951388888888889 | 0 |
| 0.8958333333333334 | 0 |
| 0.8965277777777777 | 0 |
| 0.8972222222222223 | 0 |
| 0.8979166666666667 | 0 |
| 0.8986111111111111 | 0 |
| 0.8993055555555555 | 0 |
| 0.9 | 0 |
| 0.9006944444444445 | 0 |
| 0.9013888888888889 | 0 |
| 0.9020833333333332 | 0 |
| 0.9027777777777778 | 0 |
| 0.9034722222222222 | 0 |
| 0.9041666666666667 | 0 |
| 0.904861111111111 | 0 |
| 0.9055555555555556 | 0 |
| 0.90625 | 0 |
| 0.9069444444444444 | 0 |
| 0.907638888888889 | 0 |
| 0.9083333333333333 | 0 |
| 0.9090277777777778 | 0 |
| 0.9097222222222222 | 0 |
| 0.9104166666666668 | 0 |
| 0.9111111111111111 | 0 |
| 0.9118055555555555 | 0 |
| 0.9125 | 0 |
| 0.9131944444444445 | 0 |
| 0.9138888888888889 | 0 |
| 0.9145833333333333 | 0 |
| 0.9152777777777777 | 0 |
| 0.9159722222222223 | 0 |
| 0.9166666666666666 | 0 |
| 0.9173611111111111 | 0 |
| 0.9180555555555556 | 0 |
| 0.9187500000000001 | 0 |
| 0.9194444444444444 | 0 |
| 0.9201388888888888 | 0 |
| 0.9208333333333334 | 0 |
| 0.9215277777777778 | 0 |
| 0.9222222222222222 | 0 |
| 0.9229166666666666 | 0 |
| 0.9236111111111112 | 0 |
| 0.9243055555555556 | 0 |
| 0.9249999999999999 | 0 |
| 0.9256944444444444 | 0 |
| 0.9263888888888889 | 0 |
| 0.9270833333333334 | 0 |
| 0.9277777777777777 | 0 |
| 0.9284722222222223 | 0 |
| 0.9291666666666667 | 0 |
| 0.9298611111111111 | 0 |
| 0.9305555555555555 | 0 |
| 0.93125 | 0 |
| 0.9319444444444445 | 0 |
| 0.9326388888888889 | 0 |
| 0.9333333333333332 | 0 |
| 0.9340277777777778 | 0 |
| 0.9347222222222222 | 0 |
| 0.9354166666666667 | 0 |
| 0.936111111111111 | 0 |
| 0.9368055555555556 | 0 |
| 0.9375 | 0 |
| 0.9381944444444444 | 0 |
| 0.938888888888889 | 0 |
| 0.9395833333333333 | 0 |
| 0.9402777777777778 | 0 |
| 0.9409722222222222 | 0 |
| 0.9416666666666668 | 0 |
| 0.9423611111111111 | 0 |
| 0.9430555555555555 | 0 |
| 0.94375 | 0 |
| 0.9444444444444445 | 0 |
| 0.9451388888888889 | 0 |
| 0.9458333333333333 | 0 |
| 0.9465277777777777 | 0 |
| 0.9472222222222223 | 0 |
| 0.9479166666666666 | 0 |
| 0.9486111111111111 | 0 |
| 0.9493055555555556 | 0 |
| 0.9500000000000001 | 0 |
| 0.9506944444444444 | 0 |
| 0.9513888888888888 | 0 |
| 0.9520833333333334 | 0 |
| 0.9527777777777778 | 0 |
| 0.9534722222222222 | 0 |
| 0.9541666666666666 | 0 |
| 0.9548611111111112 | 0 |
| 0.9555555555555556 | 0 |
| 0.9562499999999999 | 0 |
| 0.9569444444444444 | 0 |
| 0.9576388888888889 | 0 |
| 0.9583333333333334 | 0 |
| 0.9590277777777777 | 0 |
| 0.9597222222222223 | 0 |
| 0.9604166666666667 | 0 |
| 0.9611111111111111 | 0 |
| 0.9618055555555555 | 0 |
| 0.9625 | 0 |
| 0.9631944444444445 | 0 |
| 0.9638888888888889 | 0 |
| 0.9645833333333332 | 0 |
| 0.9652777777777778 | 0 |
| 0.9659722222222222 | 0 |
| 0.9666666666666667 | 0 |
| 0.967361111111111 | 0 |
| 0.9680555555555556 | 0 |
| 0.96875 | 0 |
| 0.9694444444444444 | 0 |
| 0.970138888888889 | 0 |
| 0.9708333333333333 | 0 |
| 0.9715277777777778 | 0 |
| 0.9722222222222222 | 0 |
| 0.9729166666666668 | 0 |
| 0.9736111111111111 | 0 |
| 0.9743055555555555 | 0 |
| 0.975 | 0 |
| 0.9756944444444445 | 0 |
| 0.9763888888888889 | 0 |
| 0.9770833333333333 | 0 |
| 0.9777777777777777 | 0 |
| 0.9784722222222223 | 0 |
| 0.9791666666666666 | 0 |
| 0.9798611111111111 | 0 |
| 0.9805555555555556 | 0 |
| 0.9812500000000001 | 0 |
| 0.9819444444444444 | 0 |
| 0.9826388888888888 | 0 |
| 0.9833333333333334 | 0 |
| 0.9840277777777778 | 0 |
| 0.9847222222222222 | 0 |
| 0.9854166666666666 | 0 |
| 0.9861111111111112 | 0 |
| 0.9868055555555556 | 0 |
| 0.9874999999999999 | 0 |
| 0.9881944444444444 | 0 |
| 0.9888888888888889 | 0 |
| 0.9895833333333334 | 0 |
| 0.9902777777777777 | 0 |
| 0.9909722222222223 | 0 |
| 0.9916666666666667 | 0 |
| 0.9923611111111111 | 0 |
| 0.9930555555555555 | 0 |
| 0.99375 | 0 |
| 0.9944444444444445 | 0 |
| 0.9951388888888889 | 0 |
| 0.9958333333333332 | 0 |
| 0.9965277777777778 | 0 |
| 0.9972222222222222 | 0 |
| 0.9979166666666667 | 0 |
| 0.998611111111111 | 0 |
| 0.9993055555555556 | 0 |